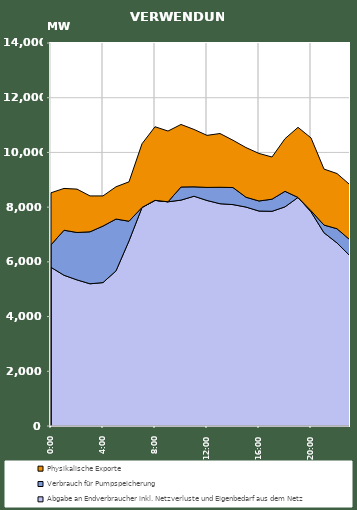
| Category | Abgabe an Endverbraucher inkl. Netzverluste und Eigenbedarf aus dem Netz | Verbrauch für Pumpspeicherung | Physikalische Exporte |
|---|---|---|---|
| 2007-01-17 | 5800.247 | 822.728 | 1901.464 |
| 2007-01-17 01:00:00 | 5509.911 | 1646.29 | 1527.954 |
| 2007-01-17 02:00:00 | 5341.313 | 1732.133 | 1585.254 |
| 2007-01-17 03:00:00 | 5198.266 | 1900.269 | 1311.401 |
| 2007-01-17 04:00:00 | 5242.33 | 2065.56 | 1102.658 |
| 2007-01-17 05:00:00 | 5670.932 | 1894.01 | 1179.686 |
| 2007-01-17 06:00:00 | 6766.66 | 718.478 | 1439.876 |
| 2007-01-17 07:00:00 | 7984.801 | 5.279 | 2326.1 |
| 2007-01-17 08:00:00 | 8247.487 | 1.171 | 2690.462 |
| 2007-01-17 09:00:00 | 8195.248 | 0.58 | 2585.298 |
| 2007-01-17 10:00:00 | 8256.554 | 479.982 | 2285.617 |
| 2007-01-17 11:00:00 | 8399.117 | 343.485 | 2097.568 |
| 2007-01-17 12:00:00 | 8243.65 | 477.262 | 1902.859 |
| 2007-01-17 13:00:00 | 8124.735 | 601.654 | 1964.727 |
| 2007-01-17 14:00:00 | 8092.657 | 624.087 | 1728.389 |
| 2007-01-17 15:00:00 | 8002.385 | 359.27 | 1815.097 |
| 2007-01-17 16:00:00 | 7856.791 | 368.496 | 1737.614 |
| 2007-01-17 17:00:00 | 7847.944 | 442.654 | 1541.172 |
| 2007-01-17 18:00:00 | 8010.657 | 567.429 | 1924.429 |
| 2007-01-17 19:00:00 | 8354.616 | 1.282 | 2560.473 |
| 2007-01-17 20:00:00 | 7828.524 | 40.467 | 2661.668 |
| 2007-01-17 21:00:00 | 7063.831 | 281.576 | 2045.684 |
| 2007-01-17 22:00:00 | 6691.262 | 519.617 | 2017.546 |
| 2007-01-17 23:00:00 | 6218.548 | 584.035 | 2014.518 |